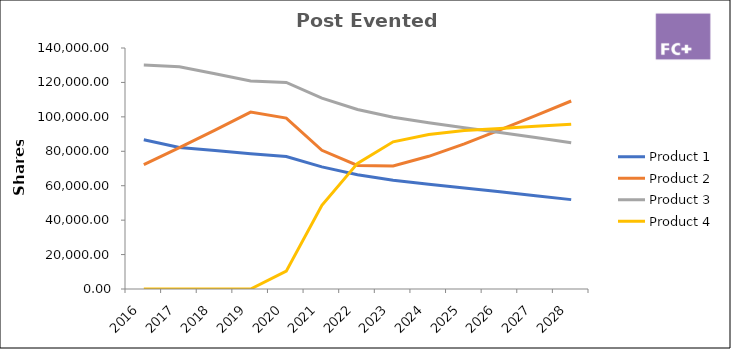
| Category | Product 1 | Product 2 | Product 3 | Product 4 |
|---|---|---|---|---|
| 2016.0 | 86708.516 | 72257.097 | 130062.774 | 0 |
| 2017.0 | 82159.853 | 82159.853 | 129108.34 | 0 |
| 2018.0 | 80413.48 | 92326.588 | 125087.636 | 0 |
| 2019.0 | 78579.115 | 102757.304 | 120890.945 | 0 |
| 2020.0 | 76990.943 | 99312.809 | 119980.297 | 10342.974 |
| 2021.0 | 70929.524 | 80586.025 | 110900.694 | 48610.44 |
| 2022.0 | 66401.957 | 71775.863 | 104273.24 | 72975.282 |
| 2023.0 | 63170.326 | 71445.617 | 99720.12 | 85489.937 |
| 2024.0 | 60817.307 | 77075.203 | 96578.622 | 89754.528 |
| 2025.0 | 58618.866 | 84292.394 | 93698.969 | 92015.089 |
| 2026.0 | 56461.939 | 92414.431 | 90901.613 | 93246.994 |
| 2027.0 | 54227.285 | 100721.254 | 87997.2 | 94478.898 |
| 2028.0 | 51914.903 | 109212.863 | 84985.727 | 95710.803 |